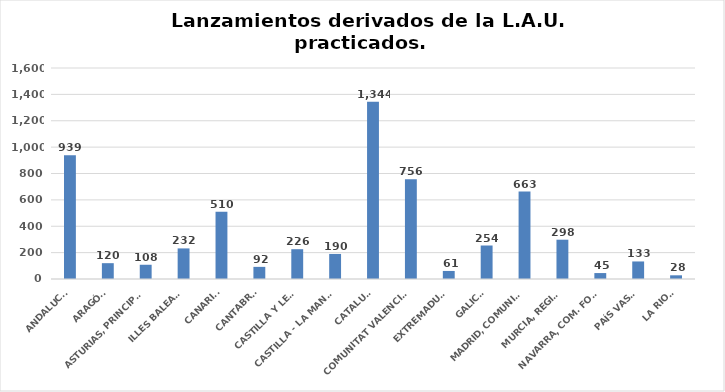
| Category | Series 0 |
|---|---|
| ANDALUCÍA | 939 |
| ARAGÓN | 120 |
| ASTURIAS, PRINCIPADO | 108 |
| ILLES BALEARS | 232 |
| CANARIAS | 510 |
| CANTABRIA | 92 |
| CASTILLA Y LEÓN | 226 |
| CASTILLA - LA MANCHA | 190 |
| CATALUÑA | 1344 |
| COMUNITAT VALENCIANA | 756 |
| EXTREMADURA | 61 |
| GALICIA | 254 |
| MADRID, COMUNIDAD | 663 |
| MURCIA, REGIÓN | 298 |
| NAVARRA, COM. FORAL | 45 |
| PAÍS VASCO | 133 |
| LA RIOJA | 28 |